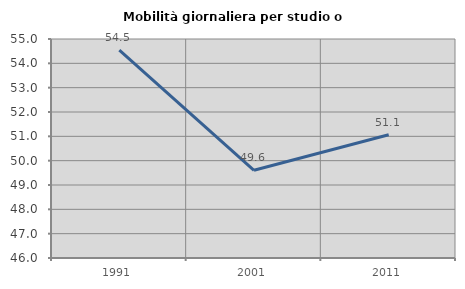
| Category | Mobilità giornaliera per studio o lavoro |
|---|---|
| 1991.0 | 54.545 |
| 2001.0 | 49.605 |
| 2011.0 | 51.066 |